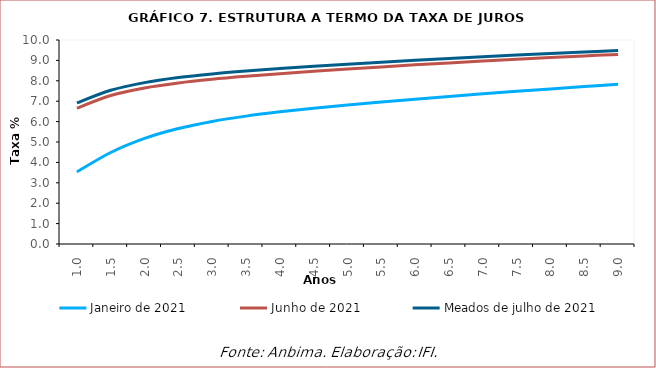
| Category | Janeiro de 2021 | Junho de 2021 | Meados de julho de 2021 |
|---|---|---|---|
| 1.0 | 3.535 | 6.658 | 6.915 |
| 1.5 | 4.485 | 7.277 | 7.535 |
| 2.0 | 5.177 | 7.65 | 7.911 |
| 2.5 | 5.662 | 7.895 | 8.158 |
| 3.0 | 6.008 | 8.074 | 8.337 |
| 3.5 | 6.269 | 8.219 | 8.478 |
| 4.0 | 6.478 | 8.347 | 8.6 |
| 4.5 | 6.656 | 8.464 | 8.71 |
| 5.0 | 6.814 | 8.574 | 8.813 |
| 5.5 | 6.961 | 8.68 | 8.911 |
| 6.0 | 7.099 | 8.781 | 9.004 |
| 6.5 | 7.232 | 8.878 | 9.093 |
| 7.0 | 7.359 | 8.97 | 9.179 |
| 7.5 | 7.483 | 9.058 | 9.26 |
| 8.0 | 7.602 | 9.141 | 9.338 |
| 8.5 | 7.718 | 9.22 | 9.413 |
| 9.0 | 7.83 | 9.295 | 9.483 |